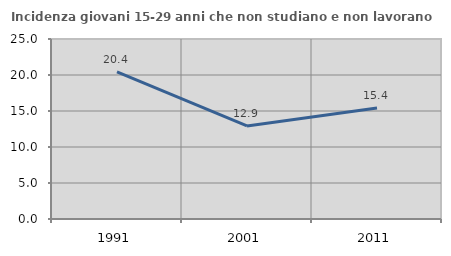
| Category | Incidenza giovani 15-29 anni che non studiano e non lavorano  |
|---|---|
| 1991.0 | 20.443 |
| 2001.0 | 12.923 |
| 2011.0 | 15.417 |